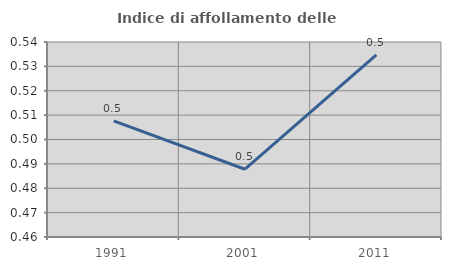
| Category | Indice di affollamento delle abitazioni  |
|---|---|
| 1991.0 | 0.508 |
| 2001.0 | 0.488 |
| 2011.0 | 0.535 |